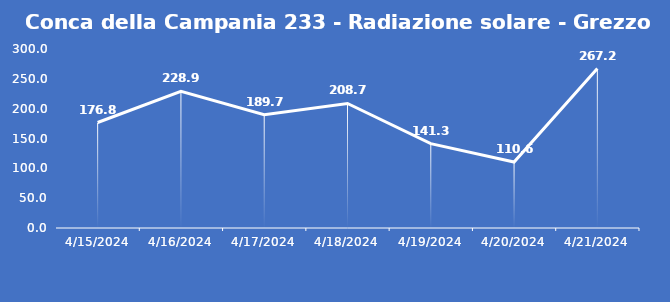
| Category | Conca della Campania 233 - Radiazione solare - Grezzo (W/m2) |
|---|---|
| 4/15/24 | 176.8 |
| 4/16/24 | 228.9 |
| 4/17/24 | 189.7 |
| 4/18/24 | 208.7 |
| 4/19/24 | 141.3 |
| 4/20/24 | 110.6 |
| 4/21/24 | 267.2 |